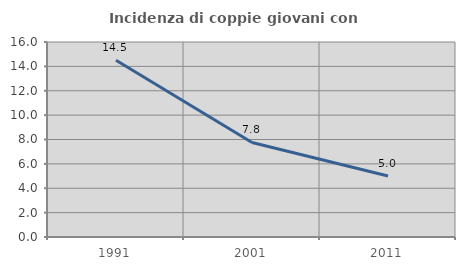
| Category | Incidenza di coppie giovani con figli |
|---|---|
| 1991.0 | 14.507 |
| 2001.0 | 7.755 |
| 2011.0 | 5.009 |